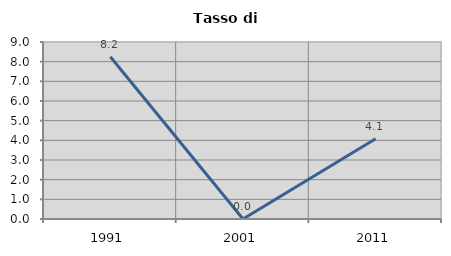
| Category | Tasso di disoccupazione   |
|---|---|
| 1991.0 | 8.247 |
| 2001.0 | 0 |
| 2011.0 | 4.082 |